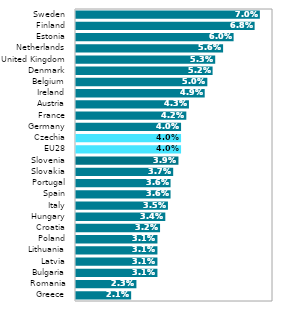
| Category | Series 0 |
|---|---|
| Greece | 0.021 |
| Romania | 0.023 |
| Bulgaria | 0.031 |
| Latvia | 0.031 |
| Lithuania | 0.031 |
| Poland | 0.031 |
| Croatia | 0.032 |
| Hungary | 0.034 |
| Italy | 0.035 |
| Spain | 0.036 |
| Portugal | 0.036 |
| Slovakia | 0.037 |
| Slovenia | 0.039 |
| EU28 | 0.04 |
| Czechia | 0.04 |
| Germany | 0.04 |
| France | 0.042 |
| Austria | 0.043 |
| Ireland | 0.049 |
| Belgium | 0.05 |
| Denmark | 0.052 |
| United Kingdom | 0.053 |
| Netherlands | 0.056 |
| Estonia | 0.06 |
| Finland | 0.068 |
| Sweden | 0.07 |